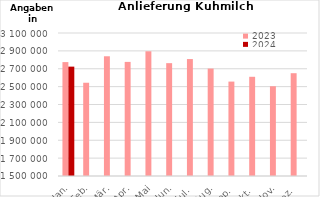
| Category | 2023 | 2024 |
|---|---|---|
| Jan. | 2774395.672 | 2723747.732 |
| Feb. | 2543432.372 | 0 |
| Mär. | 2839645.633 | 0 |
| Apr. | 2776676.837 | 0 |
| Mai | 2895424.25 | 0 |
| Jun. | 2762643.654 | 0 |
| Jul. | 2808531.242 | 0 |
| Aug. | 2701954.533 | 0 |
| Sep. | 2556397.834 | 0 |
| Okt. | 2610053.259 | 0 |
| Nov. | 2504309.96 | 0 |
| Dez. | 2650239.522 | 0 |